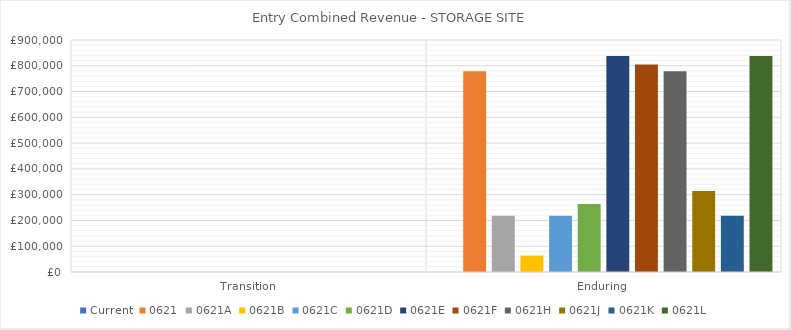
| Category | Current | 0621 | 0621A | 0621B | 0621C | 0621D | 0621E | 0621F | 0621H | 0621J | 0621K | 0621L |
|---|---|---|---|---|---|---|---|---|---|---|---|---|
| Transition | 0 | 0 | 0 | 0 | 0 | 0 | 0 | 0 | 0 | 0 | 0 | 0 |
| Enduring | 0 | 779186.952 | 218497.069 | 63668.9 | 218497.069 | 264035.103 | 837963.555 | 805190.616 | 779186.952 | 314476.021 | 218497.069 | 838343.206 |